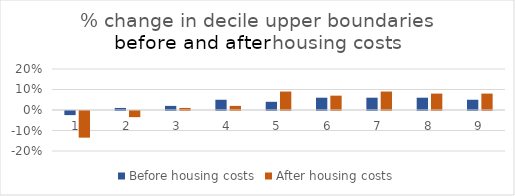
| Category | Before housing costs | After housing costs |
|---|---|---|
| 0 | -0.02 | -0.13 |
| 1 | 0.01 | -0.03 |
| 2 | 0.02 | 0.01 |
| 3 | 0.05 | 0.02 |
| 4 | 0.04 | 0.09 |
| 5 | 0.06 | 0.07 |
| 6 | 0.06 | 0.09 |
| 7 | 0.06 | 0.08 |
| 8 | 0.05 | 0.08 |